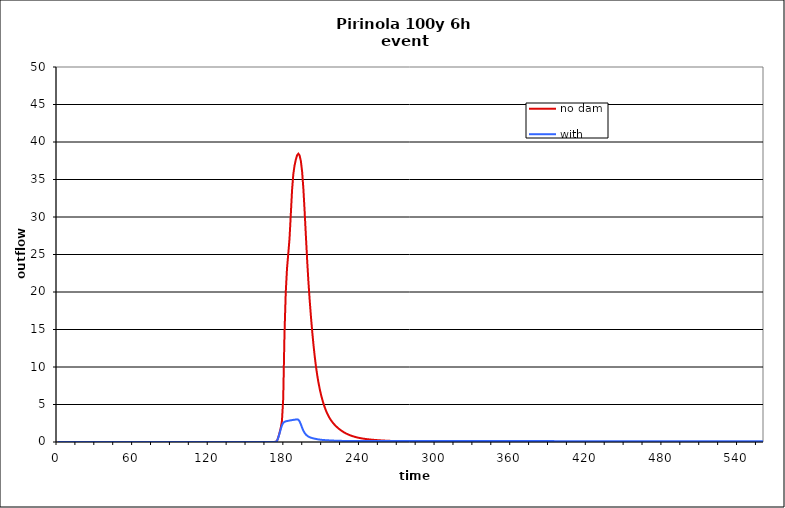
| Category | no dam | with dam |
|---|---|---|
| 0.0 | 0 | 0 |
| 1.0 | 0 | 0 |
| 2.0 | 0 | 0 |
| 3.0 | 0 | 0 |
| 4.0 | 0 | 0 |
| 5.0 | 0 | 0 |
| 6.0 | 0 | 0 |
| 7.0 | 0 | 0 |
| 8.0 | 0 | 0 |
| 9.0 | 0 | 0 |
| 10.0 | 0 | 0 |
| 11.0 | 0 | 0 |
| 12.0 | 0 | 0 |
| 13.0 | 0 | 0 |
| 14.0 | 0 | 0 |
| 15.0 | 0 | 0 |
| 16.0 | 0 | 0 |
| 17.0 | 0 | 0 |
| 18.0 | 0 | 0 |
| 19.0 | 0 | 0 |
| 20.0 | 0 | 0 |
| 21.0 | 0 | 0 |
| 22.0 | 0 | 0 |
| 23.0 | 0 | 0 |
| 24.0 | 0 | 0 |
| 25.0 | 0 | 0 |
| 26.0 | 0 | 0 |
| 27.0 | 0 | 0 |
| 28.0 | 0 | 0 |
| 29.0 | 0 | 0 |
| 30.0 | 0 | 0 |
| 31.0 | 0 | 0 |
| 32.0 | 0 | 0 |
| 33.0 | 0 | 0 |
| 34.0 | 0 | 0 |
| 35.0 | 0 | 0 |
| 36.0 | 0 | 0 |
| 37.0 | 0 | 0 |
| 38.0 | 0 | 0 |
| 39.0 | 0 | 0 |
| 40.0 | 0 | 0 |
| 41.0 | 0 | 0 |
| 42.0 | 0 | 0 |
| 43.0 | 0 | 0 |
| 44.0 | 0 | 0 |
| 45.0 | 0 | 0 |
| 46.0 | 0 | 0 |
| 47.0 | 0 | 0 |
| 48.0 | 0 | 0 |
| 49.0 | 0 | 0 |
| 50.0 | 0 | 0 |
| 51.0 | 0 | 0 |
| 52.0 | 0 | 0 |
| 53.0 | 0 | 0 |
| 54.0 | 0 | 0 |
| 55.0 | 0 | 0 |
| 56.0 | 0 | 0 |
| 57.0 | 0 | 0 |
| 58.0 | 0 | 0 |
| 59.0 | 0 | 0 |
| 60.0 | 0 | 0 |
| 61.0 | 0 | 0 |
| 62.0 | 0 | 0 |
| 63.0 | 0 | 0 |
| 64.0 | 0 | 0 |
| 65.0 | 0 | 0 |
| 66.0 | 0 | 0 |
| 67.0 | 0 | 0 |
| 68.0 | 0 | 0 |
| 69.0 | 0 | 0 |
| 70.0 | 0 | 0 |
| 71.0 | 0 | 0 |
| 72.0 | 0 | 0 |
| 73.0 | 0 | 0 |
| 74.0 | 0 | 0 |
| 75.0 | 0 | 0 |
| 76.0 | 0 | 0 |
| 77.0 | 0 | 0 |
| 78.0 | 0 | 0 |
| 79.0 | 0 | 0 |
| 80.0 | 0 | 0 |
| 81.0 | 0 | 0 |
| 82.0 | 0 | 0 |
| 83.0 | 0 | 0 |
| 84.0 | 0 | 0 |
| 85.0 | 0 | 0 |
| 86.0 | 0 | 0 |
| 87.0 | 0 | 0 |
| 88.0 | 0 | 0 |
| 89.0 | 0 | 0 |
| 90.0 | 0 | 0 |
| 91.0 | 0 | 0 |
| 92.0 | 0 | 0 |
| 93.0 | 0 | 0 |
| 94.0 | 0 | 0 |
| 95.0 | 0 | 0 |
| 96.0 | 0 | 0 |
| 97.0 | 0 | 0 |
| 98.0 | 0 | 0 |
| 99.0 | 0 | 0 |
| 100.0 | 0 | 0 |
| 101.0 | 0 | 0 |
| 102.0 | 0 | 0 |
| 103.0 | 0 | 0 |
| 104.0 | 0 | 0 |
| 105.0 | 0 | 0 |
| 106.0 | 0 | 0 |
| 107.0 | 0 | 0 |
| 108.0 | 0 | 0 |
| 109.0 | 0 | 0 |
| 110.0 | 0 | 0 |
| 111.0 | 0 | 0 |
| 112.0 | 0 | 0 |
| 113.0 | 0 | 0 |
| 114.0 | 0 | 0 |
| 115.0 | 0 | 0 |
| 116.0 | 0 | 0 |
| 117.0 | 0 | 0 |
| 118.0 | 0 | 0 |
| 119.0 | 0 | 0 |
| 120.0 | 0 | 0 |
| 121.0 | 0 | 0 |
| 122.0 | 0 | 0 |
| 123.0 | 0 | 0 |
| 124.0 | 0 | 0 |
| 125.0 | 0 | 0 |
| 126.0 | 0 | 0 |
| 127.0 | 0 | 0 |
| 128.0 | 0 | 0 |
| 129.0 | 0 | 0 |
| 130.0 | 0 | 0 |
| 131.0 | 0 | 0 |
| 132.0 | 0 | 0 |
| 133.0 | 0 | 0 |
| 134.0 | 0 | 0 |
| 135.0 | 0 | 0 |
| 136.0 | 0 | 0 |
| 137.0 | 0 | 0 |
| 138.0 | 0 | 0 |
| 139.0 | 0 | 0 |
| 140.0 | 0 | 0 |
| 141.0 | 0 | 0 |
| 142.0 | 0 | 0 |
| 143.0 | 0 | 0 |
| 144.0 | 0 | 0 |
| 145.0 | 0 | 0 |
| 146.0 | 0 | 0 |
| 147.0 | 0 | 0 |
| 148.0 | 0 | 0 |
| 149.0 | 0 | 0 |
| 150.0 | 0 | 0 |
| 151.0 | 0 | 0 |
| 152.0 | 0 | 0 |
| 153.0 | 0 | 0 |
| 154.0 | 0 | 0 |
| 155.0 | 0 | 0 |
| 156.0 | 0 | 0 |
| 157.0 | 0 | 0 |
| 158.0 | 0 | 0 |
| 159.0 | 0 | 0 |
| 160.0 | 0 | 0 |
| 161.0 | 0 | 0 |
| 162.0 | 0 | 0 |
| 163.0 | 0 | 0 |
| 164.0 | 0 | 0 |
| 165.0 | 0 | 0 |
| 166.0 | 0 | 0 |
| 167.0 | 0 | 0 |
| 168.0 | 0.001 | 0.001 |
| 169.0 | 0.001 | 0.001 |
| 170.0 | 0.002 | 0.002 |
| 171.0 | 0.003 | 0.003 |
| 172.0 | 0.011 | 0.011 |
| 173.0 | 0.033 | 0.033 |
| 174.0 | 0.098 | 0.1 |
| 175.0 | 0.575 | 0.547 |
| 176.0 | 1.163 | 1.092 |
| 177.0 | 1.841 | 1.708 |
| 178.0 | 2.817 | 2.222 |
| 179.0 | 5.78 | 2.545 |
| 180.0 | 14.324 | 2.685 |
| 181.0 | 19.9 | 2.75 |
| 182.0 | 23.105 | 2.793 |
| 183.0 | 25.063 | 2.83 |
| 184.0 | 27.108 | 2.862 |
| 185.0 | 30.266 | 2.893 |
| 186.0 | 33.531 | 2.921 |
| 187.0 | 35.69 | 2.947 |
| 188.0 | 36.862 | 2.973 |
| 189.0 | 37.649 | 2.998 |
| 190.0 | 38.223 | 3.022 |
| 191.0 | 38.439 | 2.975 |
| 192.0 | 38.212 | 2.749 |
| 193.0 | 37.464 | 2.365 |
| 194.0 | 36.046 | 1.898 |
| 195.0 | 33.766 | 1.502 |
| 196.0 | 30.75 | 1.208 |
| 197.0 | 27.446 | 0.995 |
| 198.0 | 24.23 | 0.84 |
| 199.0 | 21.374 | 0.725 |
| 200.0 | 18.903 | 0.64 |
| 201.0 | 16.727 | 0.575 |
| 202.0 | 14.758 | 0.522 |
| 203.0 | 12.981 | 0.479 |
| 204.0 | 11.412 | 0.44 |
| 205.0 | 10.057 | 0.405 |
| 206.0 | 8.894 | 0.373 |
| 207.0 | 7.898 | 0.344 |
| 208.0 | 7.044 | 0.318 |
| 209.0 | 6.307 | 0.296 |
| 210.0 | 5.661 | 0.278 |
| 211.0 | 5.095 | 0.263 |
| 212.0 | 4.595 | 0.25 |
| 213.0 | 4.155 | 0.24 |
| 214.0 | 3.767 | 0.229 |
| 215.0 | 3.432 | 0.22 |
| 216.0 | 3.137 | 0.21 |
| 217.0 | 2.88 | 0.201 |
| 218.0 | 2.651 | 0.192 |
| 219.0 | 2.445 | 0.185 |
| 220.0 | 2.259 | 0.178 |
| 221.0 | 2.09 | 0.171 |
| 222.0 | 1.933 | 0.166 |
| 223.0 | 1.788 | 0.16 |
| 224.0 | 1.655 | 0.156 |
| 225.0 | 1.531 | 0.151 |
| 226.0 | 1.416 | 0.147 |
| 227.0 | 1.31 | 0.143 |
| 228.0 | 1.214 | 0.14 |
| 229.0 | 1.125 | 0.137 |
| 230.0 | 1.044 | 0.134 |
| 231.0 | 0.97 | 0.132 |
| 232.0 | 0.902 | 0.13 |
| 233.0 | 0.839 | 0.128 |
| 234.0 | 0.782 | 0.127 |
| 235.0 | 0.73 | 0.125 |
| 236.0 | 0.681 | 0.124 |
| 237.0 | 0.636 | 0.123 |
| 238.0 | 0.595 | 0.122 |
| 239.0 | 0.557 | 0.121 |
| 240.0 | 0.522 | 0.12 |
| 241.0 | 0.491 | 0.12 |
| 242.0 | 0.462 | 0.119 |
| 243.0 | 0.436 | 0.119 |
| 244.0 | 0.412 | 0.119 |
| 245.0 | 0.389 | 0.118 |
| 246.0 | 0.369 | 0.118 |
| 247.0 | 0.349 | 0.118 |
| 248.0 | 0.331 | 0.118 |
| 249.0 | 0.314 | 0.118 |
| 250.0 | 0.298 | 0.118 |
| 251.0 | 0.283 | 0.118 |
| 252.0 | 0.269 | 0.118 |
| 253.0 | 0.256 | 0.118 |
| 254.0 | 0.243 | 0.118 |
| 255.0 | 0.231 | 0.118 |
| 256.0 | 0.22 | 0.117 |
| 257.0 | 0.21 | 0.117 |
| 258.0 | 0.199 | 0.117 |
| 259.0 | 0.19 | 0.117 |
| 260.0 | 0.181 | 0.117 |
| 261.0 | 0.172 | 0.117 |
| 262.0 | 0.164 | 0.117 |
| 263.0 | 0.156 | 0.117 |
| 264.0 | 0.149 | 0.117 |
| 265.0 | 0.142 | 0.117 |
| 266.0 | 0.136 | 0.117 |
| 267.0 | 0.13 | 0.117 |
| 268.0 | 0.124 | 0.117 |
| 269.0 | 0.118 | 0.117 |
| 270.0 | 0.113 | 0.118 |
| 271.0 | 0.108 | 0.118 |
| 272.0 | 0.103 | 0.118 |
| 273.0 | 0.099 | 0.118 |
| 274.0 | 0.095 | 0.118 |
| 275.0 | 0.091 | 0.118 |
| 276.0 | 0.087 | 0.118 |
| 277.0 | 0.083 | 0.118 |
| 278.0 | 0.08 | 0.118 |
| 279.0 | 0.076 | 0.118 |
| 280.0 | 0.073 | 0.118 |
| 281.0 | 0.07 | 0.118 |
| 282.0 | 0.067 | 0.118 |
| 283.0 | 0.064 | 0.118 |
| 284.0 | 0.062 | 0.118 |
| 285.0 | 0.059 | 0.118 |
| 286.0 | 0.057 | 0.118 |
| 287.0 | 0.055 | 0.118 |
| 288.0 | 0.052 | 0.118 |
| 289.0 | 0.05 | 0.118 |
| 290.0 | 0.048 | 0.118 |
| 291.0 | 0.046 | 0.118 |
| 292.0 | 0.045 | 0.118 |
| 293.0 | 0.043 | 0.118 |
| 294.0 | 0.041 | 0.118 |
| 295.0 | 0.04 | 0.118 |
| 296.0 | 0.038 | 0.118 |
| 297.0 | 0.037 | 0.118 |
| 298.0 | 0.035 | 0.118 |
| 299.0 | 0.034 | 0.118 |
| 300.0 | 0.033 | 0.118 |
| 301.0 | 0.031 | 0.118 |
| 302.0 | 0.03 | 0.118 |
| 303.0 | 0.029 | 0.118 |
| 304.0 | 0.028 | 0.118 |
| 305.0 | 0.027 | 0.118 |
| 306.0 | 0.026 | 0.118 |
| 307.0 | 0.025 | 0.118 |
| 308.0 | 0.024 | 0.118 |
| 309.0 | 0.023 | 0.118 |
| 310.0 | 0.022 | 0.117 |
| 311.0 | 0.021 | 0.117 |
| 312.0 | 0.021 | 0.117 |
| 313.0 | 0.02 | 0.117 |
| 314.0 | 0.019 | 0.117 |
| 315.0 | 0.018 | 0.117 |
| 316.0 | 0.018 | 0.117 |
| 317.0 | 0.017 | 0.117 |
| 318.0 | 0.017 | 0.117 |
| 319.0 | 0.016 | 0.117 |
| 320.0 | 0.015 | 0.117 |
| 321.0 | 0.015 | 0.117 |
| 322.0 | 0.014 | 0.117 |
| 323.0 | 0.014 | 0.117 |
| 324.0 | 0.013 | 0.117 |
| 325.0 | 0.013 | 0.117 |
| 326.0 | 0.012 | 0.117 |
| 327.0 | 0.012 | 0.117 |
| 328.0 | 0.011 | 0.117 |
| 329.0 | 0.011 | 0.117 |
| 330.0 | 0.011 | 0.117 |
| 331.0 | 0.01 | 0.117 |
| 332.0 | 0.01 | 0.117 |
| 333.0 | 0.009 | 0.117 |
| 334.0 | 0.009 | 0.117 |
| 335.0 | 0.009 | 0.117 |
| 336.0 | 0.008 | 0.117 |
| 337.0 | 0.008 | 0.117 |
| 338.0 | 0.008 | 0.117 |
| 339.0 | 0.007 | 0.117 |
| 340.0 | 0.007 | 0.117 |
| 341.0 | 0.007 | 0.117 |
| 342.0 | 0.006 | 0.117 |
| 343.0 | 0.006 | 0.117 |
| 344.0 | 0.006 | 0.117 |
| 345.0 | 0.006 | 0.117 |
| 346.0 | 0.005 | 0.117 |
| 347.0 | 0.005 | 0.117 |
| 348.0 | 0.005 | 0.117 |
| 349.0 | 0.005 | 0.117 |
| 350.0 | 0.005 | 0.117 |
| 351.0 | 0.004 | 0.117 |
| 352.0 | 0.004 | 0.117 |
| 353.0 | 0.004 | 0.117 |
| 354.0 | 0.004 | 0.117 |
| 355.0 | 0.004 | 0.117 |
| 356.0 | 0.003 | 0.117 |
| 357.0 | 0.003 | 0.117 |
| 358.0 | 0.003 | 0.117 |
| 359.0 | 0.003 | 0.117 |
| 360.0 | 0.003 | 0.117 |
| 361.0 | 0.003 | 0.117 |
| 362.0 | 0.002 | 0.117 |
| 363.0 | 0.002 | 0.117 |
| 364.0 | 0.002 | 0.117 |
| 365.0 | 0.002 | 0.117 |
| 366.0 | 0.002 | 0.117 |
| 367.0 | 0.002 | 0.117 |
| 368.0 | 0.002 | 0.117 |
| 369.0 | 0.002 | 0.117 |
| 370.0 | 0.002 | 0.117 |
| 371.0 | 0.001 | 0.117 |
| 372.0 | 0.001 | 0.117 |
| 373.0 | 0.001 | 0.117 |
| 374.0 | 0.001 | 0.117 |
| 375.0 | 0.001 | 0.117 |
| 376.0 | 0.001 | 0.117 |
| 377.0 | 0.001 | 0.117 |
| 378.0 | 0.001 | 0.117 |
| 379.0 | 0.001 | 0.117 |
| 380.0 | 0.001 | 0.117 |
| 381.0 | 0.001 | 0.117 |
| 382.0 | 0.001 | 0.117 |
| 383.0 | 0.001 | 0.117 |
| 384.0 | 0.001 | 0.117 |
| 385.0 | 0.001 | 0.117 |
| 386.0 | 0.001 | 0.117 |
| 387.0 | 0 | 0.117 |
| 388.0 | 0 | 0.117 |
| 389.0 | 0 | 0.117 |
| 390.0 | 0 | 0.117 |
| 391.0 | 0 | 0.117 |
| 392.0 | 0 | 0.117 |
| 393.0 | 0 | 0.117 |
| 394.0 | 0 | 0.117 |
| 395.0 | 0 | 0.117 |
| 396.0 | 0 | 0.117 |
| 397.0 | 0 | 0.117 |
| 398.0 | 0 | 0.117 |
| 399.0 | 0 | 0.117 |
| 400.0 | 0 | 0.117 |
| 401.0 | 0 | 0.117 |
| 402.0 | 0 | 0.117 |
| 403.0 | 0 | 0.117 |
| 404.0 | 0 | 0.117 |
| 405.0 | 0 | 0.117 |
| 406.0 | 0 | 0.117 |
| 407.0 | 0 | 0.117 |
| 408.0 | 0 | 0.116 |
| 409.0 | 0 | 0.116 |
| 410.0 | 0 | 0.116 |
| 411.0 | 0 | 0.116 |
| 412.0 | 0 | 0.116 |
| 413.0 | 0 | 0.116 |
| 414.0 | 0 | 0.116 |
| 415.0 | 0 | 0.116 |
| 416.0 | 0 | 0.116 |
| 417.0 | 0 | 0.116 |
| 418.0 | 0 | 0.116 |
| 419.0 | 0 | 0.116 |
| 420.0 | 0 | 0.116 |
| 421.0 | 0 | 0.116 |
| 422.0 | 0 | 0.116 |
| 423.0 | 0 | 0.116 |
| 424.0 | 0 | 0.116 |
| 425.0 | 0 | 0.116 |
| 426.0 | 0 | 0.116 |
| 427.0 | 0 | 0.116 |
| 428.0 | 0 | 0.116 |
| 429.0 | 0 | 0.116 |
| 430.0 | 0 | 0.116 |
| 431.0 | 0 | 0.116 |
| 432.0 | 0 | 0.116 |
| 433.0 | 0 | 0.116 |
| 434.0 | 0 | 0.116 |
| 435.0 | 0 | 0.116 |
| 436.0 | 0 | 0.116 |
| 437.0 | 0 | 0.116 |
| 438.0 | 0 | 0.116 |
| 439.0 | 0 | 0.116 |
| 440.0 | 0 | 0.116 |
| 441.0 | 0 | 0.116 |
| 442.0 | 0 | 0.116 |
| 443.0 | 0 | 0.116 |
| 444.0 | 0 | 0.116 |
| 445.0 | 0 | 0.116 |
| 446.0 | 0 | 0.116 |
| 447.0 | 0 | 0.116 |
| 448.0 | 0 | 0.116 |
| 449.0 | 0 | 0.116 |
| 450.0 | 0 | 0.116 |
| 451.0 | 0 | 0.116 |
| 452.0 | 0 | 0.116 |
| 453.0 | 0 | 0.116 |
| 454.0 | 0 | 0.116 |
| 455.0 | 0 | 0.116 |
| 456.0 | 0 | 0.116 |
| 457.0 | 0 | 0.116 |
| 458.0 | 0 | 0.116 |
| 459.0 | 0 | 0.116 |
| 460.0 | 0 | 0.116 |
| 461.0 | 0 | 0.116 |
| 462.0 | 0 | 0.116 |
| 463.0 | 0 | 0.116 |
| 464.0 | 0 | 0.116 |
| 465.0 | 0 | 0.116 |
| 466.0 | 0 | 0.116 |
| 467.0 | 0 | 0.116 |
| 468.0 | 0 | 0.116 |
| 469.0 | 0 | 0.116 |
| 470.0 | 0 | 0.116 |
| 471.0 | 0 | 0.116 |
| 472.0 | 0 | 0.116 |
| 473.0 | 0 | 0.116 |
| 474.0 | 0 | 0.116 |
| 475.0 | 0 | 0.116 |
| 476.0 | 0 | 0.116 |
| 477.0 | 0 | 0.116 |
| 478.0 | 0 | 0.116 |
| 479.0 | 0 | 0.116 |
| 480.0 | 0 | 0.116 |
| 481.0 | 0 | 0.116 |
| 482.0 | 0 | 0.116 |
| 483.0 | 0 | 0.116 |
| 484.0 | 0 | 0.116 |
| 485.0 | 0 | 0.116 |
| 486.0 | 0 | 0.115 |
| 487.0 | 0 | 0.115 |
| 488.0 | 0 | 0.115 |
| 489.0 | 0 | 0.115 |
| 490.0 | 0 | 0.115 |
| 491.0 | 0 | 0.115 |
| 492.0 | 0 | 0.115 |
| 493.0 | 0 | 0.115 |
| 494.0 | 0 | 0.115 |
| 495.0 | 0 | 0.115 |
| 496.0 | 0 | 0.115 |
| 497.0 | 0 | 0.115 |
| 498.0 | 0 | 0.115 |
| 499.0 | 0 | 0.115 |
| 500.0 | 0 | 0.115 |
| 501.0 | 0 | 0.115 |
| 502.0 | 0 | 0.115 |
| 503.0 | 0 | 0.115 |
| 504.0 | 0 | 0.115 |
| 505.0 | 0 | 0.115 |
| 506.0 | 0 | 0.115 |
| 507.0 | 0 | 0.115 |
| 508.0 | 0 | 0.115 |
| 509.0 | 0 | 0.115 |
| 510.0 | 0 | 0.115 |
| 511.0 | 0 | 0.115 |
| 512.0 | 0 | 0.115 |
| 513.0 | 0 | 0.115 |
| 514.0 | 0 | 0.115 |
| 515.0 | 0 | 0.115 |
| 516.0 | 0 | 0.115 |
| 517.0 | 0 | 0.115 |
| 518.0 | 0 | 0.115 |
| 519.0 | 0 | 0.115 |
| 520.0 | 0 | 0.115 |
| 521.0 | 0 | 0.115 |
| 522.0 | 0 | 0.115 |
| 523.0 | 0 | 0.115 |
| 524.0 | 0 | 0.115 |
| 525.0 | 0 | 0.115 |
| 526.0 | 0 | 0.115 |
| 527.0 | 0 | 0.115 |
| 528.0 | 0 | 0.115 |
| 529.0 | 0 | 0.115 |
| 530.0 | 0 | 0.115 |
| 531.0 | 0 | 0.115 |
| 532.0 | 0 | 0.115 |
| 533.0 | 0 | 0.115 |
| 534.0 | 0 | 0.115 |
| 535.0 | 0 | 0.115 |
| 536.0 | 0 | 0.115 |
| 537.0 | 0 | 0.115 |
| 538.0 | 0 | 0.115 |
| 539.0 | 0 | 0.115 |
| 540.0 | 0 | 0.115 |
| 541.0 | 0 | 0.115 |
| 542.0 | 0 | 0.115 |
| 543.0 | 0 | 0.115 |
| 544.0 | 0 | 0.115 |
| 545.0 | 0 | 0.115 |
| 546.0 | 0 | 0.115 |
| 547.0 | 0 | 0.115 |
| 548.0 | 0 | 0.115 |
| 549.0 | 0 | 0.115 |
| 550.0 | 0 | 0.115 |
| 551.0 | 0 | 0.115 |
| 552.0 | 0 | 0.115 |
| 553.0 | 0 | 0.115 |
| 554.0 | 0 | 0.115 |
| 555.0 | 0 | 0.115 |
| 556.0 | 0 | 0.115 |
| 557.0 | 0 | 0.115 |
| 558.0 | 0 | 0.115 |
| 559.0 | 0 | 0.115 |
| 560.0 | 0 | 0.115 |